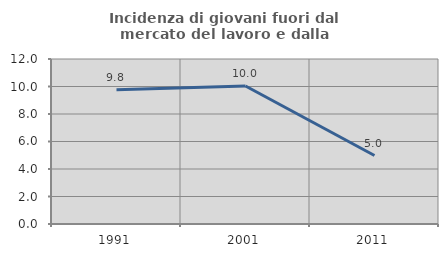
| Category | Incidenza di giovani fuori dal mercato del lavoro e dalla formazione  |
|---|---|
| 1991.0 | 9.763 |
| 2001.0 | 10.036 |
| 2011.0 | 4.981 |